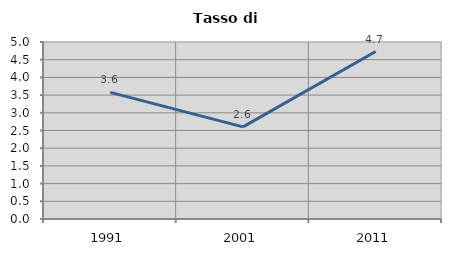
| Category | Tasso di disoccupazione   |
|---|---|
| 1991.0 | 3.578 |
| 2001.0 | 2.603 |
| 2011.0 | 4.731 |